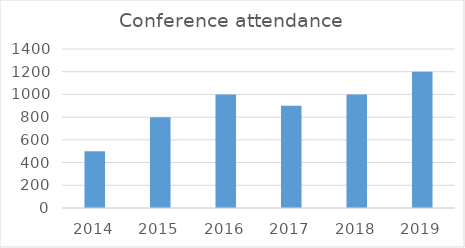
| Category | Conference attendance |
|---|---|
| 2014.0 | 500 |
| 2015.0 | 800 |
| 2016.0 | 1000 |
| 2017.0 | 900 |
| 2018.0 | 1000 |
| 2019.0 | 1200 |